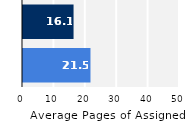
| Category | Series 0 |
|---|---|
| Upper Division | 21.49 |
| Lower Division | 16.1 |